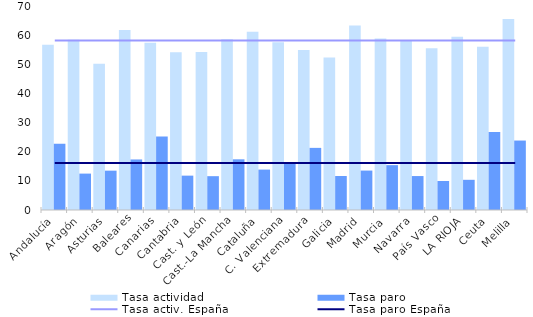
| Category | Tasa actividad | Tasa paro |
|---|---|---|
| Andalucía | 56.69 | 22.74 |
| Aragón | 58.41 | 12.49 |
| Asturias | 50.18 | 13.5 |
| Baleares | 61.79 | 17.34 |
| Canarias | 57.43 | 25.22 |
| Cantabria | 54.12 | 11.79 |
| Cast. y León | 54.21 | 11.61 |
| Cast.-La Mancha | 58.59 | 17.39 |
| Cataluña | 61.16 | 13.87 |
| C. Valenciana | 57.56 | 16.37 |
| Extremadura | 54.92 | 21.32 |
| Galicia | 52.3 | 11.66 |
| Madrid | 63.33 | 13.53 |
| Murcia | 58.81 | 15.39 |
| Navarra | 58.07 | 11.65 |
| País Vasco | 55.5 | 9.96 |
| LA RIOJA | 59.41 | 10.36 |
| Ceuta | 56.05 | 26.74 |
| Melilla | 65.54 | 23.83 |